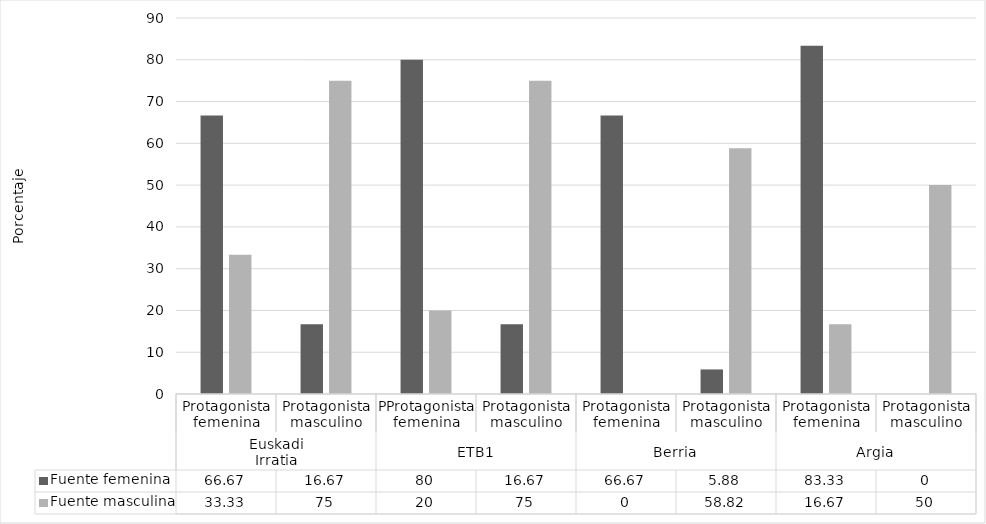
| Category | Fuente femenina | Fuente masculina |
|---|---|---|
| 0 | 66.67 | 33.33 |
| 1 | 16.67 | 75 |
| 2 | 80 | 20 |
| 3 | 16.67 | 75 |
| 4 | 66.67 | 0 |
| 5 | 5.88 | 58.82 |
| 6 | 83.33 | 16.67 |
| 7 | 0 | 50 |